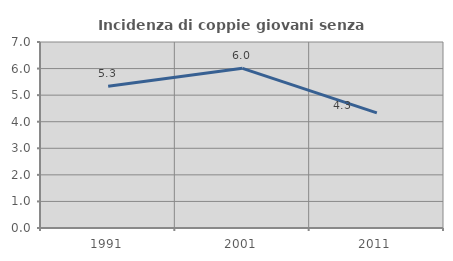
| Category | Incidenza di coppie giovani senza figli |
|---|---|
| 1991.0 | 5.336 |
| 2001.0 | 6.01 |
| 2011.0 | 4.332 |